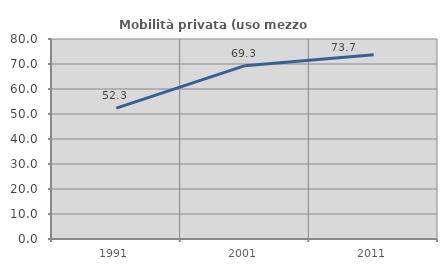
| Category | Mobilità privata (uso mezzo privato) |
|---|---|
| 1991.0 | 52.335 |
| 2001.0 | 69.329 |
| 2011.0 | 73.73 |